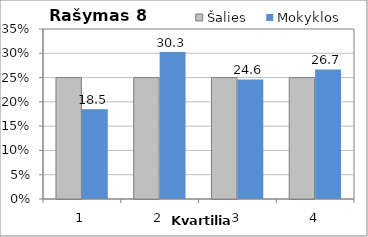
| Category | Šalies | Mokyklos |
|---|---|---|
| 1.0 | 25 | 18.462 |
| 2.0 | 25 | 30.256 |
| 3.0 | 25 | 24.615 |
| 4.0 | 25 | 26.667 |